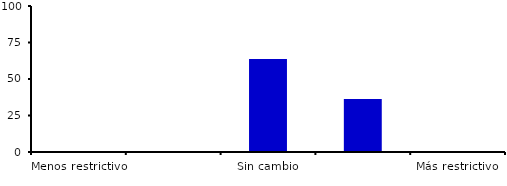
| Category | Series 0 |
|---|---|
| Menos restrictivo | 0 |
| Moderadamente menos restrictivo | 0 |
| Sin cambio | 63.636 |
| Moderadamente más restrictivo | 36.364 |
| Más restrictivo | 0 |